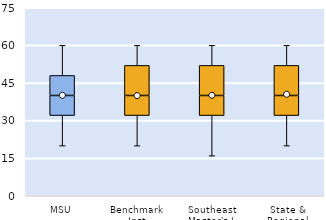
| Category | 25th | 50th | 75th |
|---|---|---|---|
| MSU | 32 | 8 | 8 |
| Benchmark Inst | 32 | 8 | 12 |
| Southeast Master's-L | 32 | 8 | 12 |
| State & Regional | 32 | 8 | 12 |